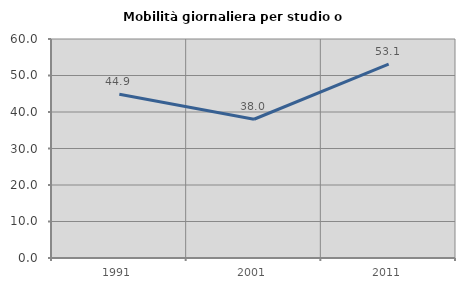
| Category | Mobilità giornaliera per studio o lavoro |
|---|---|
| 1991.0 | 44.887 |
| 2001.0 | 38.012 |
| 2011.0 | 53.11 |